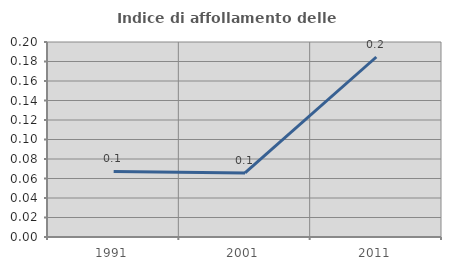
| Category | Indice di affollamento delle abitazioni  |
|---|---|
| 1991.0 | 0.067 |
| 2001.0 | 0.066 |
| 2011.0 | 0.185 |